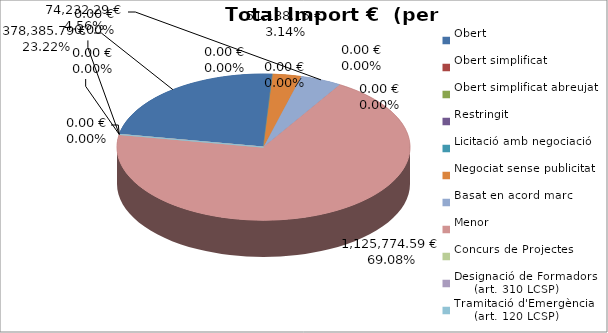
| Category | Total preu
(amb IVA) |
|---|---|
| Obert | 378385.791 |
| Obert simplificat | 0 |
| Obert simplificat abreujat | 0 |
| Restringit | 0 |
| Licitació amb negociació | 0 |
| Negociat sense publicitat | 51188.155 |
| Basat en acord marc | 74232.29 |
| Menor | 1125774.587 |
| Concurs de Projectes | 0 |
| Designació de Formadors
     (art. 310 LCSP) | 0 |
| Tramitació d'Emergència
     (art. 120 LCSP) | 0 |